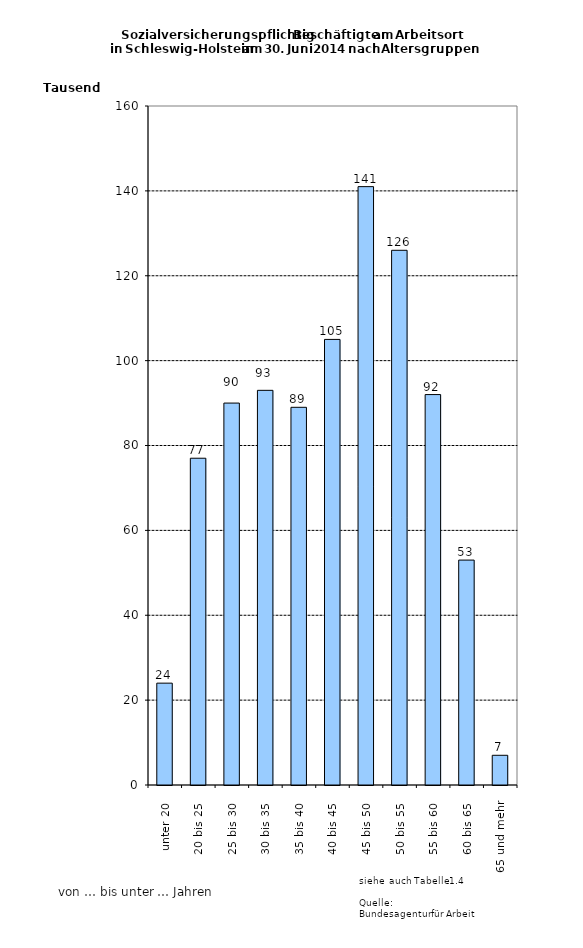
| Category | Series 0 |
|---|---|
| unter 20 | 24000 |
| 20 bis 25 | 77000 |
| 25 bis 30 | 90000 |
| 30 bis 35 | 93000 |
| 35 bis 40 | 89000 |
| 40 bis 45 | 105000 |
| 45 bis 50 | 141000 |
| 50 bis 55 | 126000 |
| 55 bis 60 | 92000 |
| 60 bis 65 | 53000 |
| 65 und mehr | 7000 |